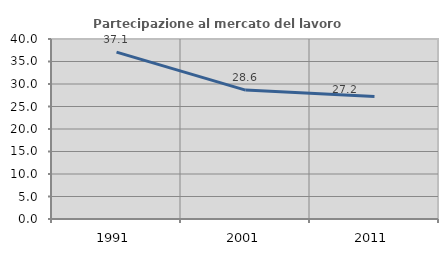
| Category | Partecipazione al mercato del lavoro  femminile |
|---|---|
| 1991.0 | 37.089 |
| 2001.0 | 28.647 |
| 2011.0 | 27.248 |